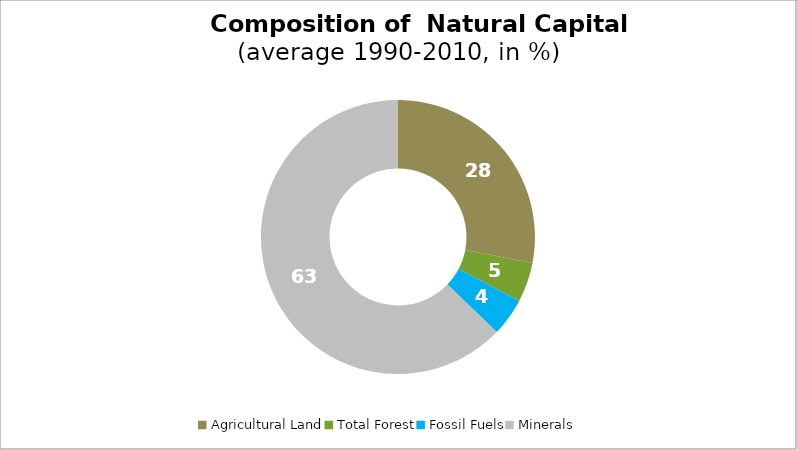
| Category | Series 0 |
|---|---|
| Agricultural Land | 28.047 |
| Total Forest | 4.681 |
| Fossil Fuels | 4.464 |
| Minerals | 62.808 |